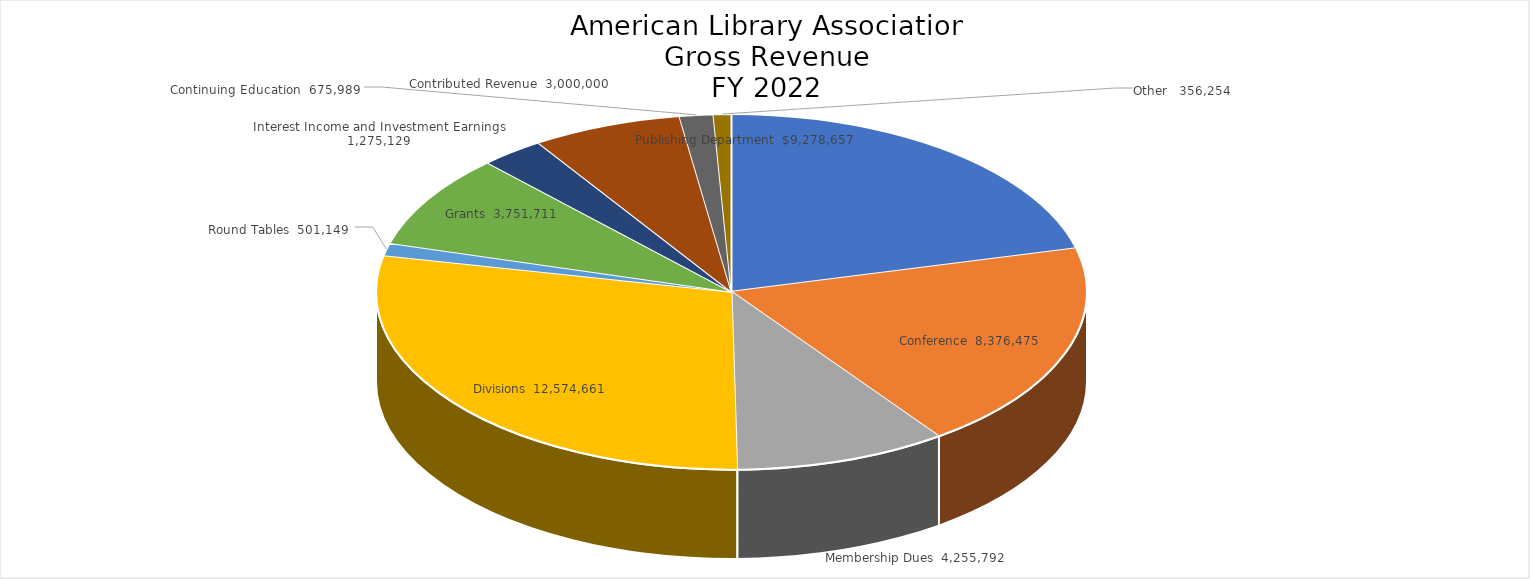
| Category | Series 0 |
|---|---|
| Publishing Department | 9278657 |
| Conference | 8376475 |
| Membership Dues | 4255792 |
| Divisions | 12574660.92 |
| Round Tables | 501149 |
| Grants | 3751711.44 |
| Interest Income and Investment Earnings | 1275129 |
| Contributed Revenue | 3000000 |
| Continuing Education | 675989 |
| Other  | 356254 |